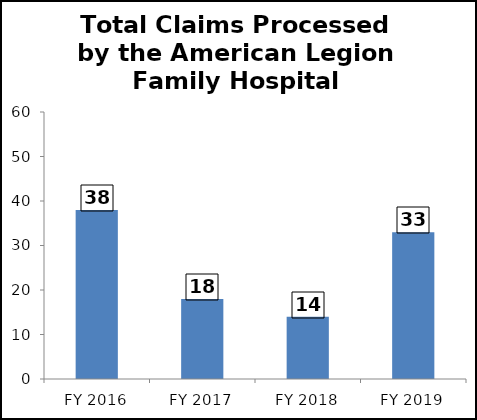
| Category | Series 0 |
|---|---|
| FY 2016 | 38 |
| FY 2017 | 18 |
| FY 2018 | 14 |
| FY 2019 | 33 |